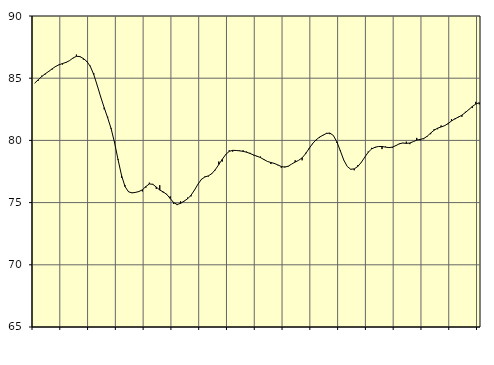
| Category | Piggar | Series 1 |
|---|---|---|
| nan | 84.6 | 84.61 |
| 87.0 | 84.8 | 84.87 |
| 87.0 | 85.2 | 85.13 |
| 87.0 | 85.3 | 85.35 |
| nan | 85.5 | 85.54 |
| 88.0 | 85.7 | 85.75 |
| 88.0 | 85.9 | 85.94 |
| 88.0 | 86.1 | 86.08 |
| nan | 86.1 | 86.18 |
| 89.0 | 86.3 | 86.27 |
| 89.0 | 86.4 | 86.41 |
| 89.0 | 86.6 | 86.62 |
| nan | 86.9 | 86.76 |
| 90.0 | 86.7 | 86.74 |
| 90.0 | 86.5 | 86.58 |
| 90.0 | 86.3 | 86.35 |
| nan | 86 | 85.95 |
| 91.0 | 85.4 | 85.29 |
| 91.0 | 84.4 | 84.42 |
| 91.0 | 83.5 | 83.49 |
| nan | 82.5 | 82.63 |
| 92.0 | 81.9 | 81.82 |
| 92.0 | 81 | 80.94 |
| 92.0 | 79.9 | 79.8 |
| nan | 78.5 | 78.44 |
| 93.0 | 77 | 77.18 |
| 93.0 | 76.4 | 76.29 |
| 93.0 | 75.9 | 75.87 |
| nan | 75.8 | 75.78 |
| 94.0 | 75.8 | 75.82 |
| 94.0 | 75.9 | 75.89 |
| 94.0 | 75.9 | 76.03 |
| nan | 76.2 | 76.29 |
| 95.0 | 76.6 | 76.5 |
| 95.0 | 76.5 | 76.47 |
| 95.0 | 76.1 | 76.25 |
| nan | 76.4 | 76.01 |
| 96.0 | 75.8 | 75.86 |
| 96.0 | 75.7 | 75.66 |
| 96.0 | 75.5 | 75.33 |
| nan | 74.9 | 75 |
| 97.0 | 74.8 | 74.85 |
| 97.0 | 75.1 | 74.94 |
| 97.0 | 75.1 | 75.12 |
| nan | 75.4 | 75.3 |
| 98.0 | 75.5 | 75.59 |
| 98.0 | 76 | 76.01 |
| 98.0 | 76.5 | 76.48 |
| nan | 76.9 | 76.87 |
| 99.0 | 77.1 | 77.06 |
| 99.0 | 77.1 | 77.15 |
| 99.0 | 77.3 | 77.33 |
| nan | 77.6 | 77.65 |
| 0.0 | 78.3 | 78.06 |
| 0.0 | 78.3 | 78.48 |
| 0.0 | 78.9 | 78.87 |
| nan | 79.2 | 79.12 |
| 1.0 | 79.1 | 79.2 |
| 1.0 | 79.2 | 79.19 |
| 1.0 | 79.2 | 79.16 |
| nan | 79.2 | 79.12 |
| 2.0 | 79.1 | 79.05 |
| 2.0 | 79 | 78.95 |
| 2.0 | 78.8 | 78.83 |
| nan | 78.7 | 78.73 |
| 3.0 | 78.7 | 78.62 |
| 3.0 | 78.5 | 78.46 |
| 3.0 | 78.3 | 78.31 |
| nan | 78.1 | 78.22 |
| 4.0 | 78.1 | 78.15 |
| 4.0 | 78 | 78.03 |
| 4.0 | 77.8 | 77.9 |
| nan | 77.9 | 77.85 |
| 5.0 | 77.9 | 77.93 |
| 5.0 | 78.1 | 78.1 |
| 5.0 | 78.4 | 78.26 |
| nan | 78.4 | 78.4 |
| 6.0 | 78.4 | 78.6 |
| 6.0 | 79 | 78.93 |
| 6.0 | 79.3 | 79.35 |
| nan | 79.7 | 79.74 |
| 7.0 | 80 | 80.04 |
| 7.0 | 80.2 | 80.26 |
| 7.0 | 80.4 | 80.42 |
| nan | 80.6 | 80.56 |
| 8.0 | 80.5 | 80.59 |
| 8.0 | 80.4 | 80.39 |
| 8.0 | 79.8 | 79.88 |
| nan | 79.2 | 79.16 |
| 9.0 | 78.4 | 78.41 |
| 9.0 | 77.9 | 77.9 |
| 9.0 | 77.7 | 77.68 |
| nan | 77.6 | 77.71 |
| 10.0 | 78 | 77.9 |
| 10.0 | 78.2 | 78.22 |
| 10.0 | 78.6 | 78.64 |
| nan | 79.1 | 79.04 |
| 11.0 | 79.4 | 79.31 |
| 11.0 | 79.4 | 79.45 |
| 11.0 | 79.5 | 79.51 |
| nan | 79.3 | 79.51 |
| 12.0 | 79.5 | 79.46 |
| 12.0 | 79.4 | 79.42 |
| 12.0 | 79.4 | 79.46 |
| nan | 79.6 | 79.58 |
| 13.0 | 79.7 | 79.73 |
| 13.0 | 79.8 | 79.79 |
| 13.0 | 79.9 | 79.76 |
| nan | 79.7 | 79.79 |
| 14.0 | 79.9 | 79.9 |
| 14.0 | 80.2 | 80.02 |
| 14.0 | 80 | 80.08 |
| nan | 80.1 | 80.15 |
| 15.0 | 80.3 | 80.33 |
| 15.0 | 80.5 | 80.59 |
| 15.0 | 80.9 | 80.82 |
| nan | 80.9 | 80.98 |
| 16.0 | 81.2 | 81.08 |
| 16.0 | 81.2 | 81.18 |
| 16.0 | 81.3 | 81.35 |
| nan | 81.7 | 81.56 |
| 17.0 | 81.7 | 81.74 |
| 17.0 | 81.9 | 81.87 |
| 17.0 | 81.9 | 82.03 |
| nan | 82.3 | 82.24 |
| 18.0 | 82.5 | 82.48 |
| 18.0 | 82.6 | 82.73 |
| 18.0 | 83.1 | 82.92 |
| nan | 82.9 | 83.03 |